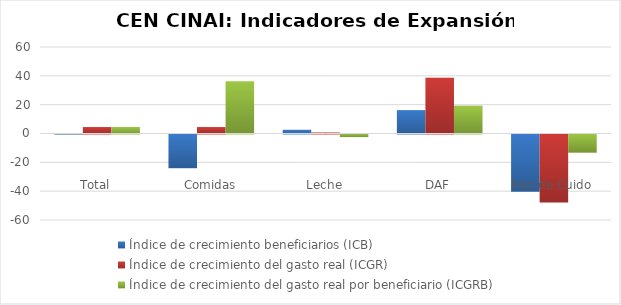
| Category | Índice de crecimiento beneficiarios (ICB)  | Índice de crecimiento del gasto real (ICGR)  | Índice de crecimiento del gasto real por beneficiario (ICGRB)  |
|---|---|---|---|
| Total | -0.014 | 4.477 | 4.491 |
| Comidas | -23.341 | 4.475 | 36.285 |
| Leche | 2.574 | 0.729 | -1.799 |
| DAF | 16.223 | 38.588 | 19.243 |
| Red de Cuido | -39.638 | -47.249 | -12.61 |